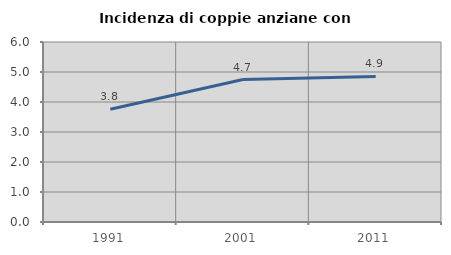
| Category | Incidenza di coppie anziane con figli |
|---|---|
| 1991.0 | 3.759 |
| 2001.0 | 4.748 |
| 2011.0 | 4.851 |